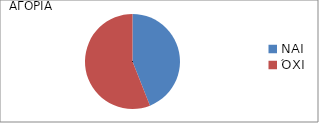
| Category | Series 0 |
|---|---|
| ΝΑΙ | 0.44 |
| ΌΧΙ  | 0.56 |